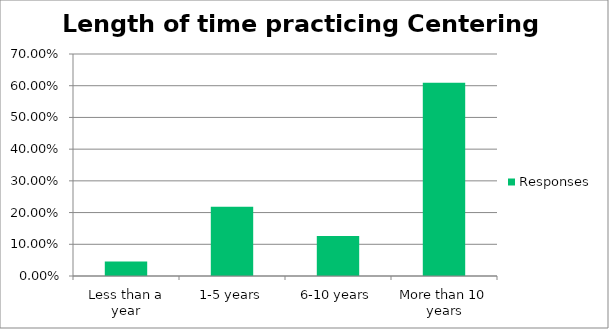
| Category | Responses |
|---|---|
| Less than a year | 0.046 |
| 1-5 years | 0.218 |
| 6-10 years | 0.126 |
| More than 10 years | 0.609 |